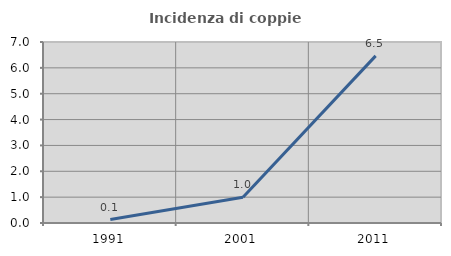
| Category | Incidenza di coppie miste |
|---|---|
| 1991.0 | 0.133 |
| 2001.0 | 0.994 |
| 2011.0 | 6.463 |